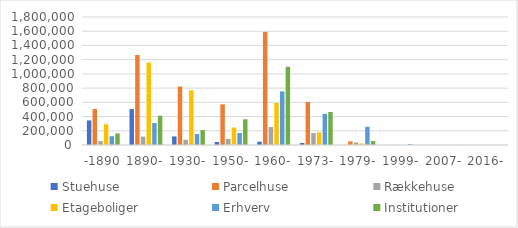
| Category | Stuehuse | Parcelhuse | Rækkehuse | Etageboliger | Erhverv | Institutioner |
|---|---|---|---|---|---|---|
| -1890 | 345480.727 | 507595.043 | 54875.445 | 291683.852 | 123582.974 | 162961.486 |
| 1890- | 504958.651 | 1265679.065 | 117960.223 | 1160232.802 | 308726.398 | 412442.898 |
| 1930- | 120386.223 | 822442.634 | 73440.539 | 769620.076 | 153678.015 | 209195.116 |
| 1950- | 42116.459 | 571735.138 | 86284.196 | 245820.233 | 167925.511 | 361723.502 |
| 1960- | 47054.745 | 1590409.794 | 252321.024 | 591722.766 | 753873.941 | 1099969.615 |
| 1973- | 28058.701 | 604657.695 | 167486.879 | 177686.681 | 438823.943 | 464110.537 |
| 1979- | 1199.151 | 51155.336 | 36175.524 | 21276.66 | 256267.317 | 55681.852 |
| 1999- | 0 | 1424.622 | 247.959 | 394.648 | 12404.514 | 1579.492 |
| 2007- | 0 | 1184.48 | 0 | 0 | 435.235 | 1304.833 |
| 2016- | 0 | 0 | 0 | 0 | 0 | 0 |